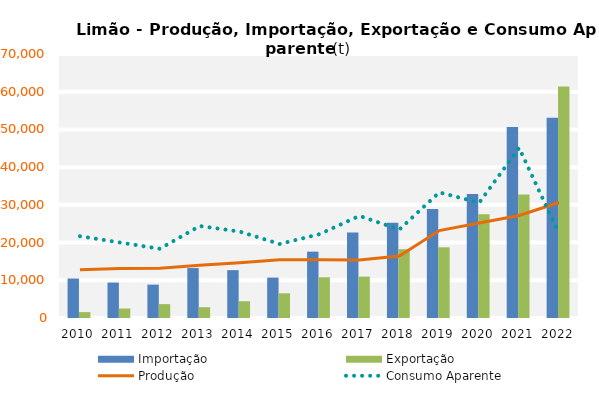
| Category | Importação | Exportação |
|---|---|---|
| 2010.0 | 10469.293 | 1549.666 |
| 2011.0 | 9395.292 | 2505.153 |
| 2012.0 | 8852.744 | 3682.153 |
| 2013.0 | 13240.865 | 2865.738 |
| 2014.0 | 12689.089 | 4443.66 |
| 2015.0 | 10714.612 | 6545.576 |
| 2016.0 | 17588.108 | 10800.445 |
| 2017.0 | 22670.386 | 10976.463 |
| 2018.0 | 25243.701 | 18234.978 |
| 2019.0 | 28869.391 | 18743.6 |
| 2020.0 | 32894.453 | 27531.931 |
| 2021.0 | 50665.368 | 32744.222 |
| 2022.0 | 53099.442 | 61390.512 |